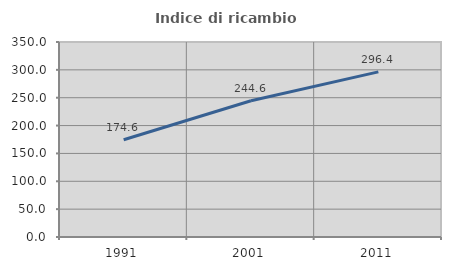
| Category | Indice di ricambio occupazionale  |
|---|---|
| 1991.0 | 174.648 |
| 2001.0 | 244.574 |
| 2011.0 | 296.4 |